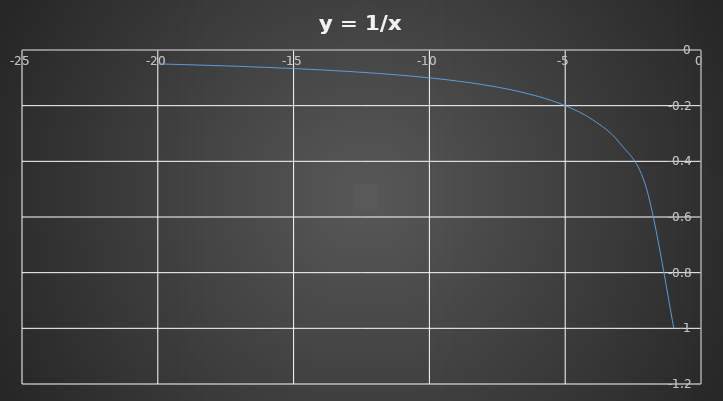
| Category | Series 0 |
|---|---|
| -20.0 | -0.05 |
| -19.0 | -0.053 |
| -18.0 | -0.056 |
| -17.0 | -0.059 |
| -16.0 | -0.062 |
| -15.0 | -0.067 |
| -14.0 | -0.071 |
| -13.0 | -0.077 |
| -12.0 | -0.083 |
| -11.0 | -0.091 |
| -10.0 | -0.1 |
| -9.0 | -0.111 |
| -8.0 | -0.125 |
| -7.0 | -0.143 |
| -6.0 | -0.167 |
| -5.0 | -0.2 |
| -4.0 | -0.25 |
| -3.0 | -0.333 |
| -2.0 | -0.5 |
| -1.0 | -1 |